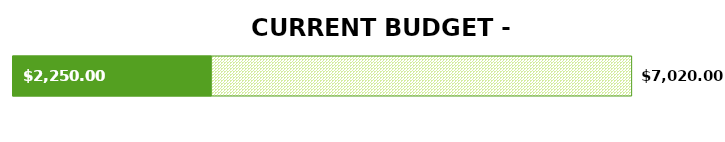
| Category | Series 0 | Series 1 | Series 2 |
|---|---|---|---|
| Total Expenses | 0 | 7020 | 2250 |